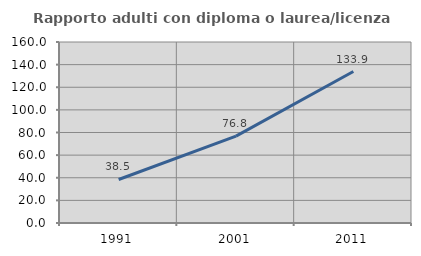
| Category | Rapporto adulti con diploma o laurea/licenza media  |
|---|---|
| 1991.0 | 38.481 |
| 2001.0 | 76.759 |
| 2011.0 | 133.918 |